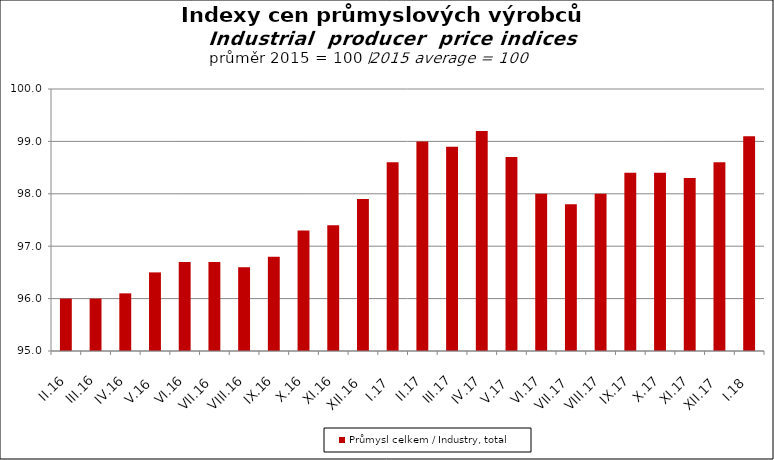
| Category | Průmysl celkem / Industry, total |
|---|---|
| II.16 | 96 |
| III.16 | 96 |
| IV.16 | 96.1 |
| V.16 | 96.5 |
| VI.16 | 96.7 |
| VII.16 | 96.7 |
| VIII.16 | 96.6 |
| IX.16 | 96.8 |
| X.16 | 97.3 |
| XI.16 | 97.4 |
| XII.16 | 97.9 |
| I.17 | 98.6 |
| II.17 | 99 |
| III.17 | 98.9 |
| IV.17 | 99.2 |
| V.17 | 98.7 |
| VI.17 | 98 |
| VII.17 | 97.8 |
| VIII.17 | 98 |
| IX.17 | 98.4 |
| X.17 | 98.4 |
| XI.17 | 98.3 |
| XII.17 | 98.6 |
| I.18 | 99.1 |